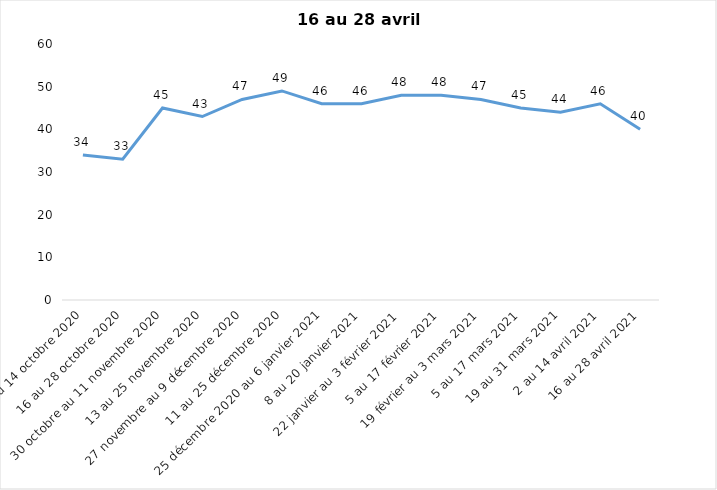
| Category | Toujours aux trois mesures |
|---|---|
| 2 au 14 octobre 2020 | 34 |
| 16 au 28 octobre 2020 | 33 |
| 30 octobre au 11 novembre 2020 | 45 |
| 13 au 25 novembre 2020 | 43 |
| 27 novembre au 9 décembre 2020 | 47 |
| 11 au 25 décembre 2020 | 49 |
| 25 décembre 2020 au 6 janvier 2021 | 46 |
| 8 au 20 janvier 2021 | 46 |
| 22 janvier au 3 février 2021 | 48 |
| 5 au 17 février 2021 | 48 |
| 19 février au 3 mars 2021 | 47 |
| 5 au 17 mars 2021 | 45 |
| 19 au 31 mars 2021 | 44 |
| 2 au 14 avril 2021 | 46 |
| 16 au 28 avril 2021 | 40 |